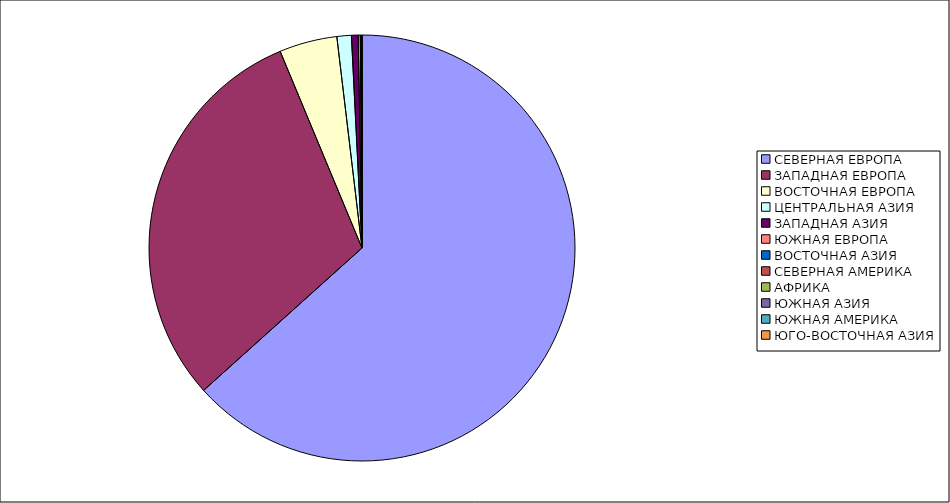
| Category | Оборот |
|---|---|
| СЕВЕРНАЯ ЕВРОПА | 63.344 |
| ЗАПАДНАЯ ЕВРОПА | 30.379 |
| ВОСТОЧНАЯ ЕВРОПА | 4.388 |
| ЦЕНТРАЛЬНАЯ АЗИЯ | 1.096 |
| ЗАПАДНАЯ АЗИЯ | 0.505 |
| ЮЖНАЯ ЕВРОПА | 0.163 |
| ВОСТОЧНАЯ АЗИЯ | 0.043 |
| СЕВЕРНАЯ АМЕРИКА | 0.027 |
| АФРИКА | 0.022 |
| ЮЖНАЯ АЗИЯ | 0.021 |
| ЮЖНАЯ АМЕРИКА | 0.009 |
| ЮГО-ВОСТОЧНАЯ АЗИЯ | 0.001 |